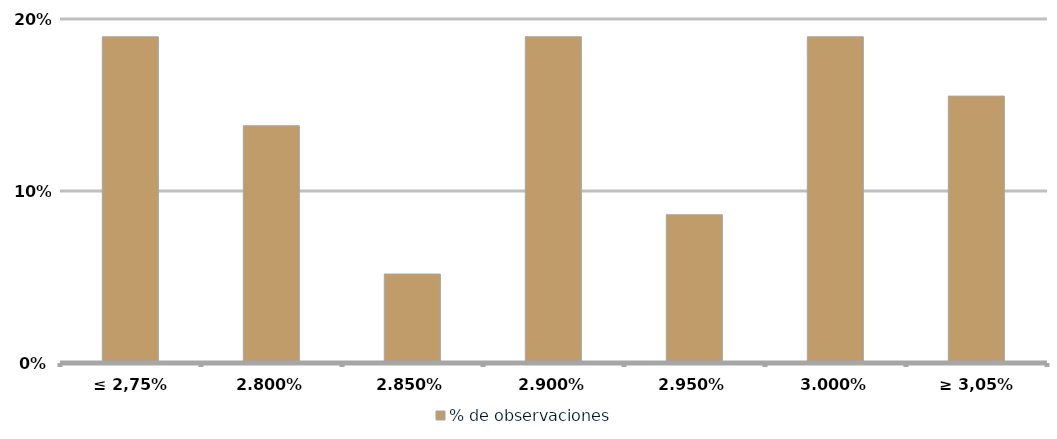
| Category | % de observaciones  |
|---|---|
| ≤ 2,75% | 0.19 |
| 2,80% | 0.138 |
| 2,85% | 0.052 |
| 2,90% | 0.19 |
| 2,95% | 0.086 |
| 3,00% | 0.19 |
| ≥ 3,05% | 0.155 |